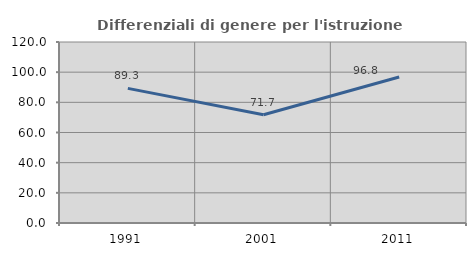
| Category | Differenziali di genere per l'istruzione superiore |
|---|---|
| 1991.0 | 89.258 |
| 2001.0 | 71.746 |
| 2011.0 | 96.784 |